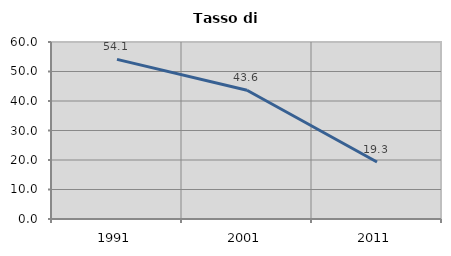
| Category | Tasso di disoccupazione   |
|---|---|
| 1991.0 | 54.101 |
| 2001.0 | 43.649 |
| 2011.0 | 19.306 |